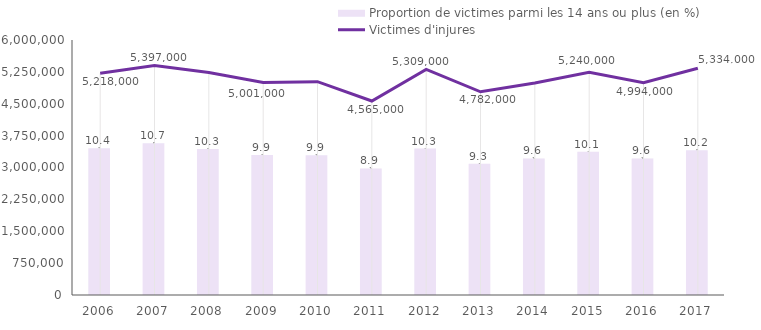
| Category | Proportion de victimes parmi les 14 ans ou plus (en %) |
|---|---|
| 2006.0 | 10.366 |
| 2007.0 | 10.714 |
| 2008.0 | 10.313 |
| 2009.0 | 9.888 |
| 2010.0 | 9.869 |
| 2011.0 | 8.934 |
| 2012.0 | 10.335 |
| 2013.0 | 9.266 |
| 2014.0 | 9.636 |
| 2015.0 | 10.12 |
| 2016.0 | 9.637 |
| 2017.0 | 10.224 |